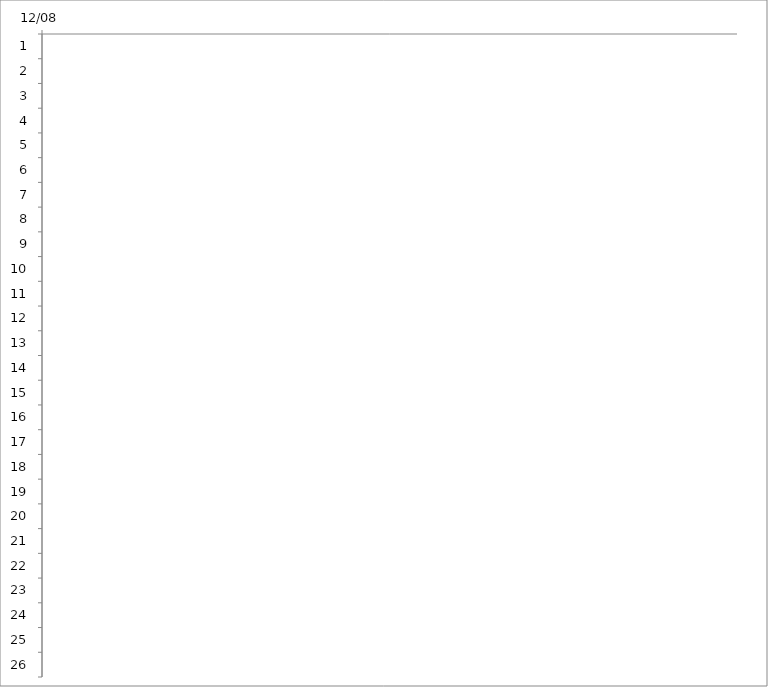
| Category | Fecha de inicio | DURACIÓN |
|---|---|---|
| 0 |  | 0 |
| 1 |  | 0 |
| 2 |  | 0 |
| 3 |  | 0 |
| 4 |  | 0 |
| 5 |  | 0 |
| 6 |  | 0 |
| 7 |  | 0 |
| 8 |  | 0 |
| 9 |  | 0 |
| 10 |  | 0 |
| 11 |  | 0 |
| 12 |  | 0 |
| 13 |  | 0 |
| 14 |  | 0 |
| 15 |  | 0 |
| 16 |  | 0 |
| 17 |  | 0 |
| 18 |  | 0 |
| 19 |  | 0 |
| 20 |  | 0 |
| 21 |  | 0 |
| 22 |  | 0 |
| 23 |  | 0 |
| 24 |  | 0 |
| 25 |  | 0 |